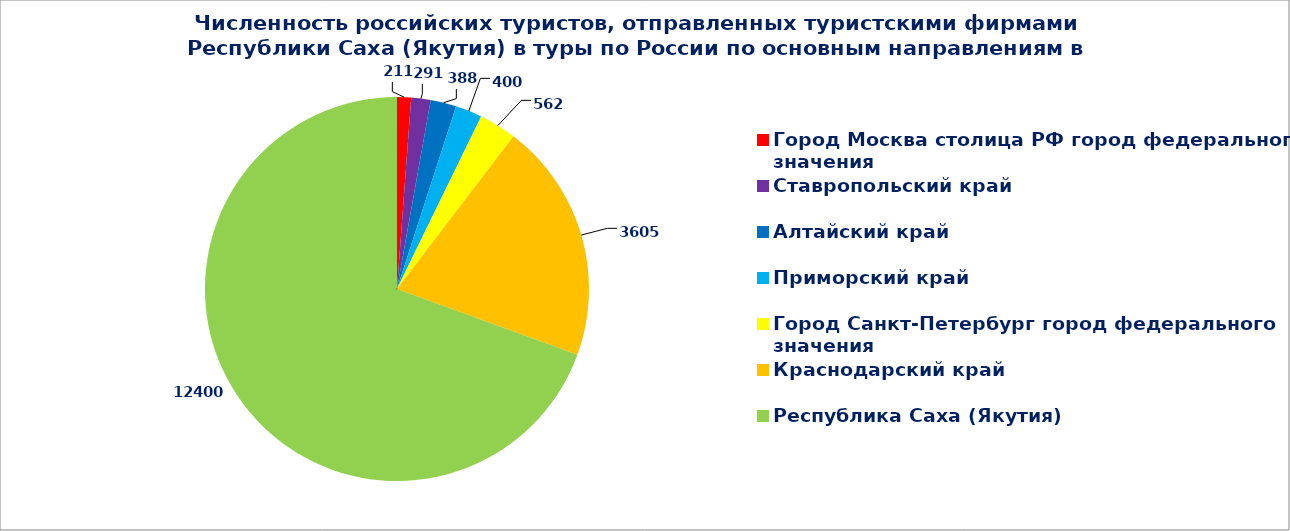
| Category | Series 0 |
|---|---|
| Город Москва столица РФ город федерального значения | 211 |
| Ставропольский край | 291 |
| Алтайский край | 388 |
| Приморский край | 400 |
| Город Санкт-Петербург город федерального значения | 562 |
| Краснодарский край | 3605 |
| Республика Саха (Якутия) | 12400 |